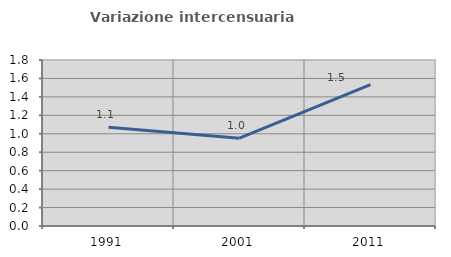
| Category | Variazione intercensuaria annua |
|---|---|
| 1991.0 | 1.071 |
| 2001.0 | 0.952 |
| 2011.0 | 1.533 |